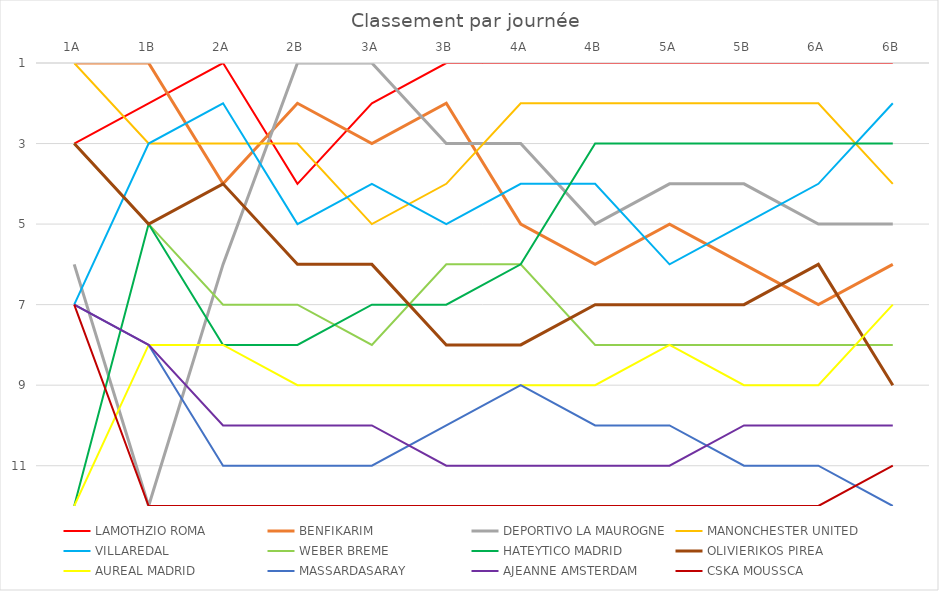
| Category | LAMOTHZIO ROMA | BENFIKARIM | DEPORTIVO LA MAUROGNE | MANONCHESTER UNITED | VILLAREDAL | WEBER BREME | HATEYTICO MADRID | OLIVIERIKOS PIREA | AUREAL MADRID  | MASSARDASARAY | AJEANNE AMSTERDAM | CSKA MOUSSCA |
|---|---|---|---|---|---|---|---|---|---|---|---|---|
| 1A | 3 | 1 | 6 | 1 | 7 | 3 | 12 | 3 | 12 | 7 | 7 | 7 |
| 1B | 2 | 1 | 12 | 3 | 3 | 5 | 5 | 5 | 8 | 8 | 8 | 12 |
| 2A | 1 | 4 | 6 | 3 | 2 | 7 | 8 | 4 | 8 | 11 | 10 | 12 |
| 2B | 4 | 2 | 1 | 3 | 5 | 7 | 8 | 6 | 9 | 11 | 10 | 12 |
| 3A | 2 | 3 | 1 | 5 | 4 | 8 | 7 | 6 | 9 | 11 | 10 | 12 |
| 3B | 1 | 2 | 3 | 4 | 5 | 6 | 7 | 8 | 9 | 10 | 11 | 12 |
| 4A | 1 | 5 | 3 | 2 | 4 | 6 | 6 | 8 | 9 | 9 | 11 | 12 |
| 4B | 1 | 6 | 5 | 2 | 4 | 8 | 3 | 7 | 9 | 10 | 11 | 12 |
| 5A | 1 | 5 | 4 | 2 | 6 | 8 | 3 | 7 | 8 | 10 | 11 | 12 |
| 5B | 1 | 6 | 4 | 2 | 5 | 8 | 3 | 7 | 9 | 11 | 10 | 12 |
| 6A | 1 | 7 | 5 | 2 | 4 | 8 | 3 | 6 | 9 | 11 | 10 | 12 |
| 6B | 1 | 6 | 5 | 4 | 2 | 8 | 3 | 9 | 7 | 12 | 10 | 11 |